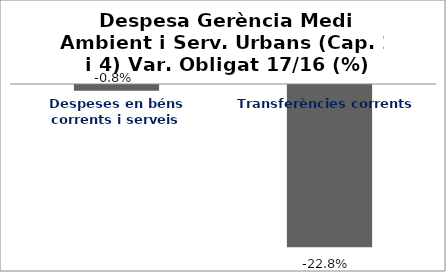
| Category | Series 0 |
|---|---|
| Despeses en béns corrents i serveis | -0.008 |
| Transferències corrents | -0.228 |